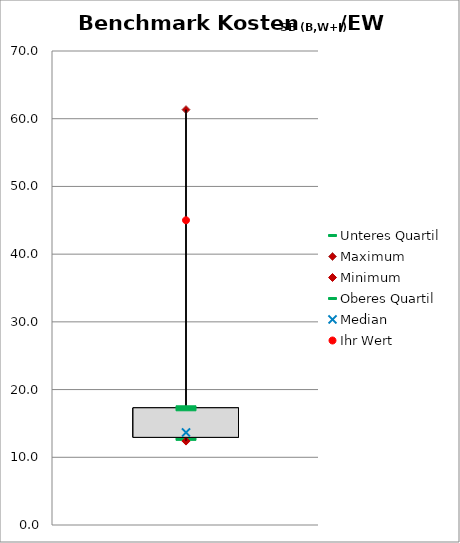
| Category | Unteres Quartil | Maximum | Minimum | Oberes Quartil |
|---|---|---|---|---|
| Alter SB | 12.945 | 61.339 | 12.39 | 17.309 |